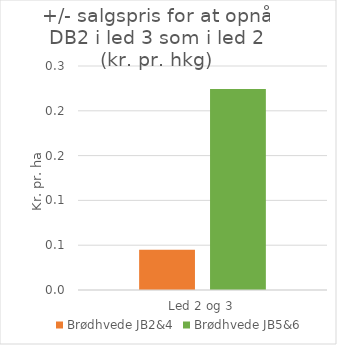
| Category | Brødhvede |  Brødhvede JB2&4  |  Brødhvede JB5&6  |
|---|---|---|---|
| Led 2 og 3 |  | 0.045 | 0.224 |